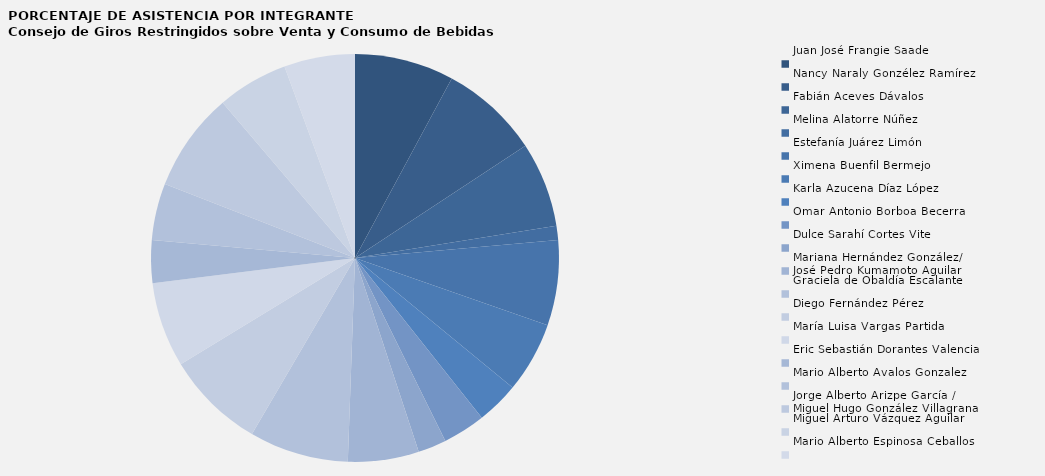
| Category | Juan José Frangie Saade |
|---|---|
| Juan José Frangie Saade | 100 |
| Nancy Naraly Gonzélez Ramírez | 100 |
| Fabián Aceves Dávalos  | 85.714 |
| Melina Alatorre Núñez  | 14.286 |
| Estefanía Juárez Limón | 85.714 |
| Ximena Buenfil Bermejo | 71.429 |
| Karla Azucena Díaz López | 42.857 |
| Omar Antonio Borboa Becerra | 42.857 |
| Dulce Sarahí Cortes Vite | 28.571 |
| Mariana Hernández González/
José Pedro Kumamoto Aguilar | 71.429 |
| Graciela de Obaldía Escalante | 100 |
| Diego Fernández Pérez | 100 |
| María Luisa Vargas Partida | 85.714 |
| Eric Sebastián Dorantes Valencia | 42.857 |
| Mario Alberto Avalos Gonzalez | 57.143 |
| Jorge Alberto Arizpe García / 
Miguel Hugo González Villagrana | 100 |
| Miguel Arturo Vázquez Aguilar | 71.429 |
| Mario Alberto Espinosa Ceballos | 71.429 |